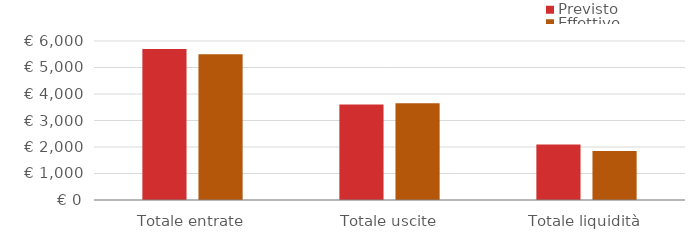
| Category | Previsto | Effettivo |
|---|---|---|
| Totale entrate | 5700 | 5500 |
| Totale uscite | 3603 | 3655 |
| Totale liquidità | 2097 | 1845 |